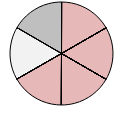
| Category | Series 1 |
|---|---|
| + + | 0 |
| + | 0 |
| o | 0 |
| - | 1 |
| - - | 0 |
| + + | 0 |
| + | 0 |
| o | 0 |
| - | 1 |
| - - | 0 |
| + + | 0 |
| + | 0 |
| o | 0 |
| - | 1 |
| - - | 0 |
| + + | 0 |
| + | 0 |
| o | 0 |
| - | 1 |
| - - | 0 |
| * * | 0 |
| * | 0 |
| o | 1 |
| * * | 0 |
| * | 1 |
| o | 0 |